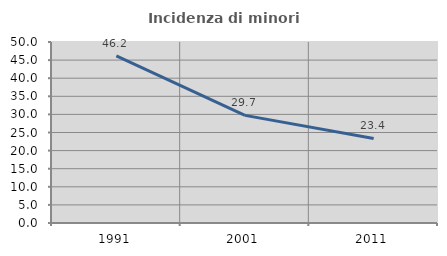
| Category | Incidenza di minori stranieri |
|---|---|
| 1991.0 | 46.154 |
| 2001.0 | 29.73 |
| 2011.0 | 23.37 |